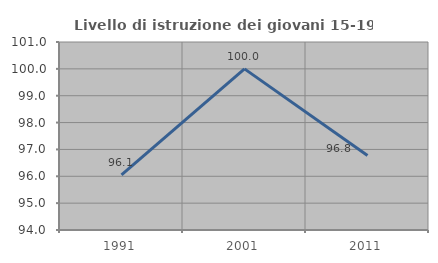
| Category | Livello di istruzione dei giovani 15-19 anni |
|---|---|
| 1991.0 | 96.053 |
| 2001.0 | 100 |
| 2011.0 | 96.774 |